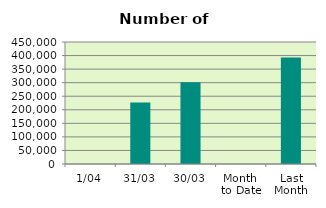
| Category | Series 0 |
|---|---|
| 1/04 | 0 |
| 31/03 | 226976 |
| 30/03 | 301154 |
| Month 
to Date | 0 |
| Last
Month | 392496.174 |